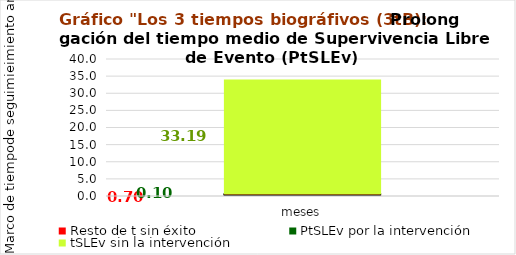
| Category | Resto de t sin éxito | PtSLEv por la intervención | tSLEv sin la intervención |
|---|---|---|---|
| meses | 0.704 | 0.104 | 33.192 |